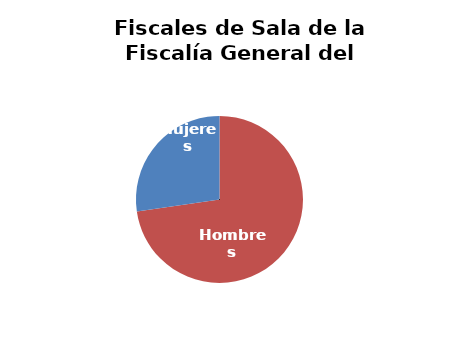
| Category | Fiscales de Sala de la Fiscalía General del Estado |
|---|---|
| Hombres | 8 |
| Mujeres | 3 |